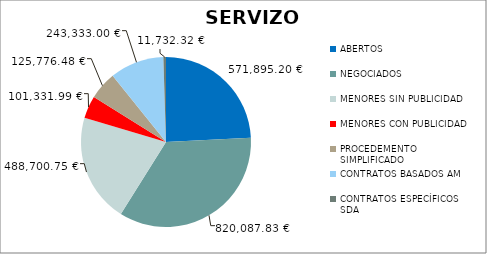
| Category | Series 0 |
|---|---|
| ABERTOS  | 571895.2 |
| NEGOCIADOS  | 820087.83 |
| MENORES SIN PUBLICIDAD | 488700.75 |
| MENORES CON PUBLICIDAD | 101331.99 |
| PROCEDEMENTO SIMPLIFICADO | 125776.48 |
| CONTRATOS BASADOS AM | 243333 |
| CONTRATOS ESPECÍFICOS SDA | 11732.32 |